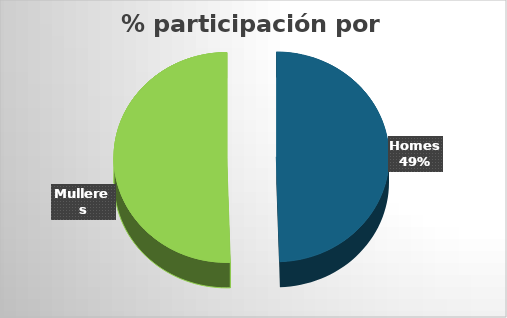
| Category | Series 0 |
|---|---|
| Homes | 146 |
| Mulleres | 149 |